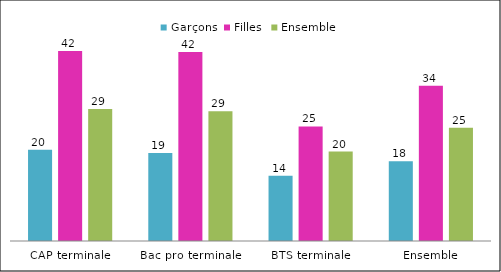
| Category | Garçons | Filles | Ensemble |
|---|---|---|---|
| CAP terminale | 20.12 | 41.93 | 29.13 |
| Bac pro terminale | 19.41 | 41.69 | 28.64 |
| BTS terminale | 14.41 | 25.27 | 19.72 |
| Ensemble | 17.58 | 34.24 | 25 |